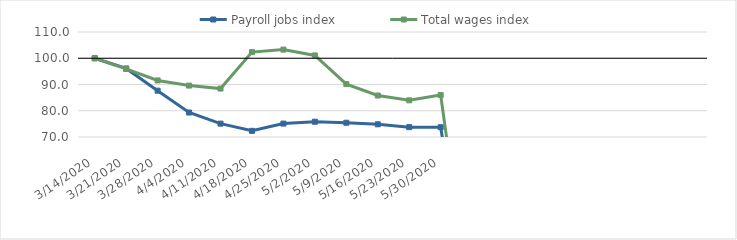
| Category | Payroll jobs index | Total wages index |
|---|---|---|
| 14/03/2020 | 100 | 100 |
| 21/03/2020 | 96.119 | 95.925 |
| 28/03/2020 | 87.644 | 91.549 |
| 04/04/2020 | 79.326 | 89.582 |
| 11/04/2020 | 75.094 | 88.451 |
| 18/04/2020 | 72.351 | 102.333 |
| 25/04/2020 | 75.113 | 103.293 |
| 02/05/2020 | 75.819 | 101.075 |
| 09/05/2020 | 75.43 | 90.148 |
| 16/05/2020 | 74.845 | 85.801 |
| 23/05/2020 | 73.755 | 83.974 |
| 30/05/2020 | 73.725 | 85.981 |